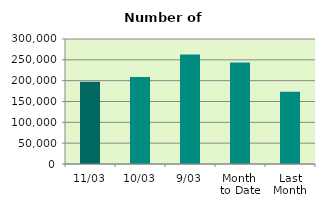
| Category | Series 0 |
|---|---|
| 11/03 | 197532 |
| 10/03 | 208748 |
| 9/03 | 262694 |
| Month 
to Date | 243562.222 |
| Last
Month | 173197.3 |